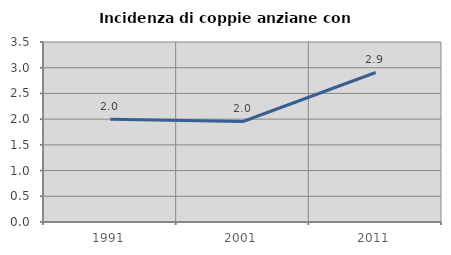
| Category | Incidenza di coppie anziane con figli |
|---|---|
| 1991.0 | 2 |
| 2001.0 | 1.954 |
| 2011.0 | 2.907 |